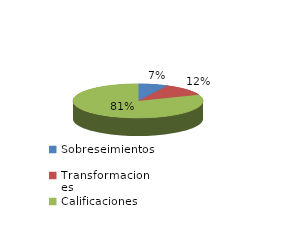
| Category | Series 0 |
|---|---|
| Sobreseimientos | 41 |
| Transformaciones | 64 |
| Calificaciones | 443 |